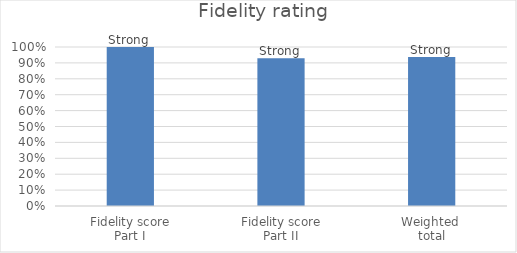
| Category | Series 0 |
|---|---|
| Fidelity score
Part I | 1 |
| Fidelity score
Part II | 0.929 |
| Weighted 
total | 0.938 |